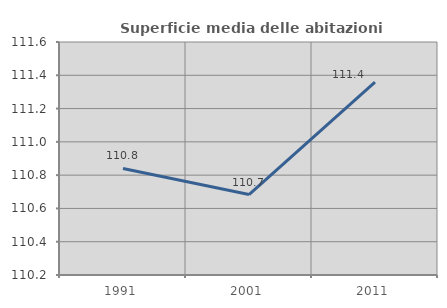
| Category | Superficie media delle abitazioni occupate |
|---|---|
| 1991.0 | 110.84 |
| 2001.0 | 110.683 |
| 2011.0 | 111.359 |